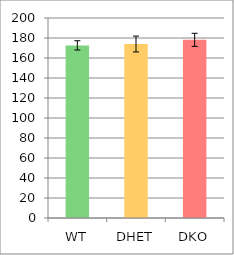
| Category | Series 0 |
|---|---|
| WT | 172.623 |
| DHET | 173.982 |
| DKO | 178.158 |